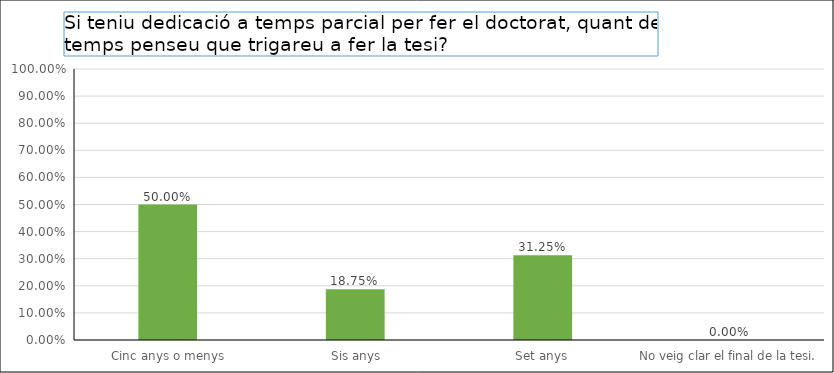
| Category | Series 0 |
|---|---|
|  Cinc anys o menys | 0.5 |
|  Sis anys | 0.188 |
| Set anys | 0.312 |
| No veig clar el final de la tesi. | 0 |